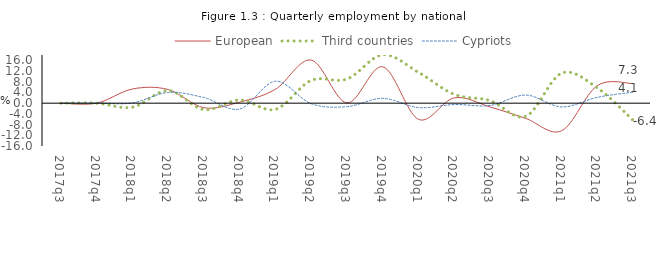
| Category | European | Third countries |
|---|---|---|
| 2017q3 | 0 | 0 |
| 2017q4 | 0 | 0 |
| 2018q1 | 5.3 | -1.5 |
| 2018q2 | 5.1 | 4.7 |
| 2018q3 | -1.7 | -2.4 |
| 2018q4 | 0.4 | 1.2 |
| 2019q1 | 5.2 | -2.3 |
| 2019q2 | 16.1 | 8.5 |
| 2019q3 | 0.1 | 9 |
| 2019q4 | 13.6 | 18.1 |
| 2020q1 | -6.054 | 11.501 |
| 2020q2 | 2 | 3.3 |
| 2020q3 | -1.397 | 0.948 |
| 2020q4 | -5.7 | -4.9 |
| 2021q1 | -10.3 | 11.2 |
| 2021q2 | 6.6 | 5.7 |
| 2021q3 | 7.3 | -6.4 |